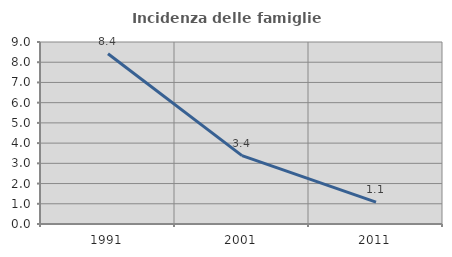
| Category | Incidenza delle famiglie numerose |
|---|---|
| 1991.0 | 8.421 |
| 2001.0 | 3.382 |
| 2011.0 | 1.082 |